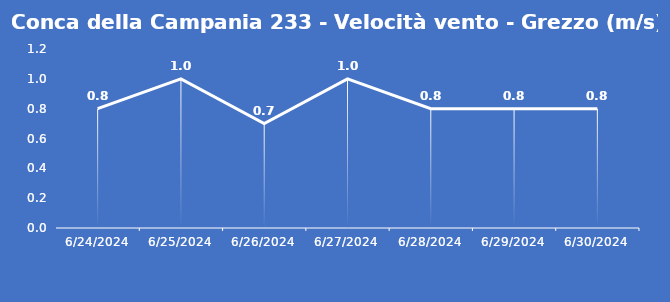
| Category | Conca della Campania 233 - Velocità vento - Grezzo (m/s) |
|---|---|
| 6/24/24 | 0.8 |
| 6/25/24 | 1 |
| 6/26/24 | 0.7 |
| 6/27/24 | 1 |
| 6/28/24 | 0.8 |
| 6/29/24 | 0.8 |
| 6/30/24 | 0.8 |